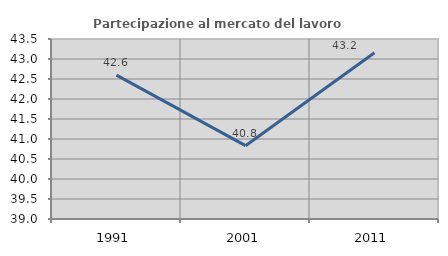
| Category | Partecipazione al mercato del lavoro  femminile |
|---|---|
| 1991.0 | 42.596 |
| 2001.0 | 40.833 |
| 2011.0 | 43.154 |